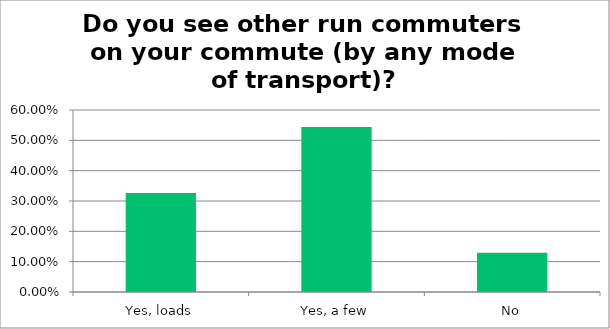
| Category | Responses |
|---|---|
| Yes, loads | 0.326 |
| Yes, a few | 0.544 |
| No | 0.13 |